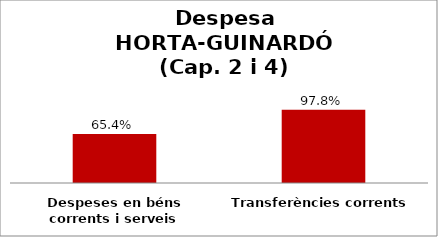
| Category | Series 0 |
|---|---|
| Despeses en béns corrents i serveis | 0.654 |
| Transferències corrents | 0.978 |